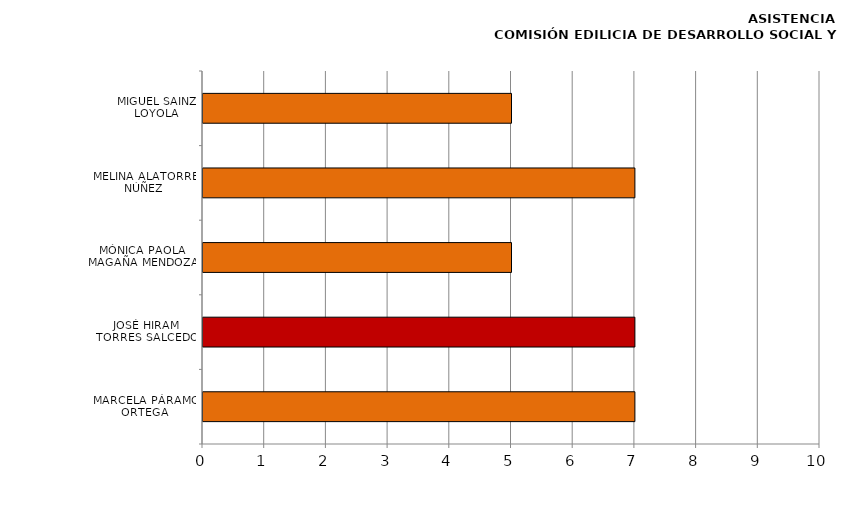
| Category | Series 0 |
|---|---|
| MARCELA PÁRAMO ORTEGA | 7 |
| JOSÉ HIRAM TORRES SALCEDO | 7 |
| MÓNICA PAOLA MAGAÑA MENDOZA | 5 |
| MELINA ALATORRE NÚÑEZ | 7 |
| MIGUEL SAINZ LOYOLA | 5 |